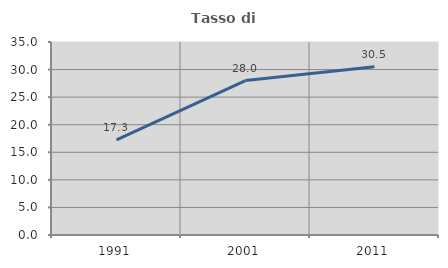
| Category | Tasso di occupazione   |
|---|---|
| 1991.0 | 17.261 |
| 2001.0 | 28.003 |
| 2011.0 | 30.526 |